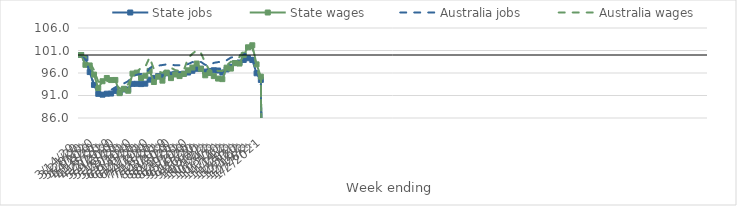
| Category | State jobs | State wages | Australia jobs | Australia wages |
|---|---|---|---|---|
| 14/03/2020 | 100 | 100 | 100 | 100 |
| 21/03/2020 | 99.28 | 97.819 | 99.218 | 99.669 |
| 28/03/2020 | 96.206 | 97.68 | 96.159 | 98.38 |
| 04/04/2020 | 93.358 | 95.652 | 93.511 | 96.663 |
| 11/04/2020 | 91.366 | 92.649 | 91.845 | 94.08 |
| 18/04/2020 | 91.183 | 94.171 | 91.454 | 93.993 |
| 25/04/2020 | 91.402 | 94.893 | 91.82 | 94.131 |
| 02/05/2020 | 91.435 | 94.43 | 92.24 | 94.625 |
| 09/05/2020 | 92.023 | 94.454 | 92.814 | 93.438 |
| 16/05/2020 | 91.679 | 91.523 | 93.355 | 92.628 |
| 23/05/2020 | 92.339 | 92.496 | 93.675 | 92.257 |
| 30/05/2020 | 92.339 | 92.052 | 94.182 | 93.555 |
| 06/06/2020 | 93.584 | 95.864 | 95.129 | 95.487 |
| 13/06/2020 | 93.597 | 96.08 | 95.64 | 96.179 |
| 20/06/2020 | 93.534 | 94.887 | 95.803 | 97.167 |
| 27/06/2020 | 93.628 | 95.391 | 95.768 | 97.377 |
| 04/07/2020 | 94.52 | 96.467 | 97.026 | 99.465 |
| 11/07/2020 | 94.914 | 93.998 | 97.722 | 96.839 |
| 18/07/2020 | 95.319 | 95.181 | 97.64 | 96.355 |
| 25/07/2020 | 95.286 | 94.302 | 97.768 | 96.035 |
| 01/08/2020 | 95.932 | 96.081 | 97.912 | 96.762 |
| 08/08/2020 | 95.675 | 94.863 | 97.848 | 97.159 |
| 15/08/2020 | 95.83 | 95.668 | 97.715 | 96.636 |
| 22/08/2020 | 95.753 | 95.314 | 97.726 | 96.439 |
| 29/08/2020 | 95.834 | 95.81 | 97.792 | 96.622 |
| 05/09/2020 | 96.102 | 96.598 | 97.988 | 99.323 |
| 12/09/2020 | 96.496 | 97.21 | 98.415 | 100.272 |
| 19/09/2020 | 96.933 | 98.102 | 98.579 | 101.043 |
| 26/09/2020 | 96.957 | 96.931 | 98.452 | 100.421 |
| 03/10/2020 | 96.318 | 95.488 | 97.813 | 98.297 |
| 10/10/2020 | 96.454 | 95.996 | 97.688 | 96.578 |
| 17/10/2020 | 96.61 | 95.308 | 98.252 | 97.02 |
| 24/10/2020 | 96.551 | 94.762 | 98.419 | 96.422 |
| 31/10/2020 | 96.096 | 94.637 | 98.499 | 96.422 |
| 07/11/2020 | 96.796 | 97.189 | 98.826 | 97.695 |
| 14/11/2020 | 97.388 | 96.981 | 99.425 | 98.506 |
| 21/11/2020 | 98.202 | 98.195 | 99.648 | 98.519 |
| 28/11/2020 | 98.328 | 98.099 | 99.873 | 99.566 |
| 05/12/2020 | 98.896 | 100.015 | 100.204 | 100.773 |
| 12/12/2020 | 99.284 | 101.714 | 100.228 | 101.122 |
| 19/12/2020 | 98.885 | 102.161 | 99.39 | 101.653 |
| 26/12/2020 | 95.937 | 97.922 | 96.352 | 97.474 |
| 02/01/2021 | 94.456 | 95.192 | 93.927 | 93.755 |